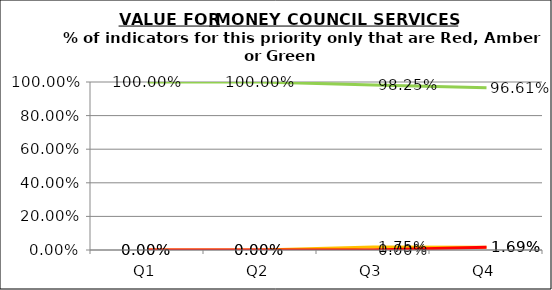
| Category | Green | Amber | Red |
|---|---|---|---|
| Q1 | 1 | 0 | 0 |
| Q2 | 1 | 0 | 0 |
| Q3 | 0.982 | 0.018 | 0 |
| Q4 | 0.966 | 0.017 | 0.017 |